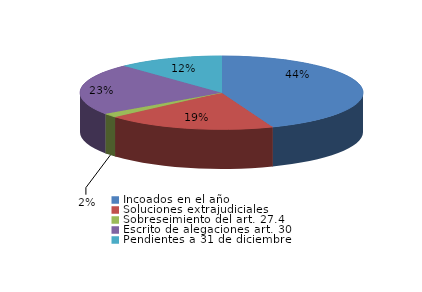
| Category | Series 0 |
|---|---|
| Incoados en el año | 631 |
| Soluciones extrajudiciales | 277 |
| Sobreseimiento del art. 27.4 | 25 |
| Escrito de alegaciones art. 30 | 325 |
| Pendientes a 31 de diciembre | 172 |